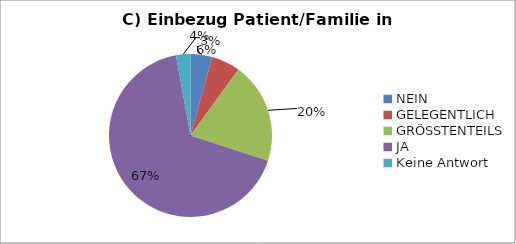
| Category | Series 0 |
|---|---|
| NEIN | 3 |
| GELEGENTLICH | 4 |
| GRÖSSTENTEILS | 14 |
| JA | 47 |
| Keine Antwort | 2 |